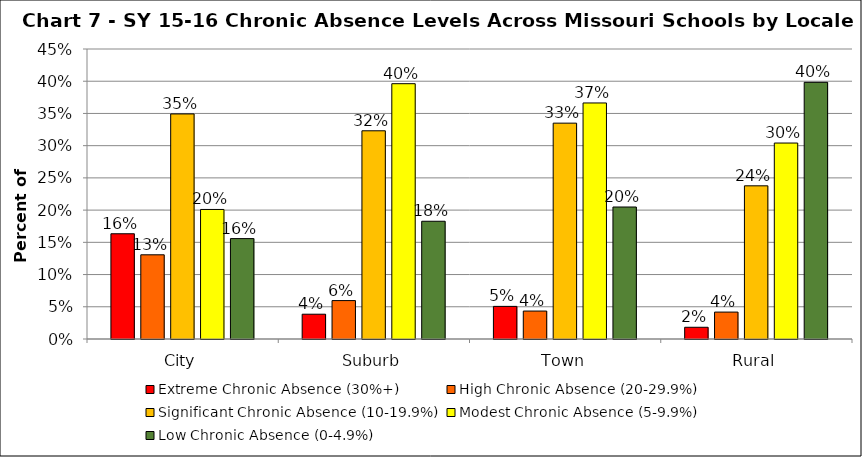
| Category | Extreme Chronic Absence (30%+) | High Chronic Absence (20-29.9%) | Significant Chronic Absence (10-19.9%) | Modest Chronic Absence (5-9.9%) | Low Chronic Absence (0-4.9%) |
|---|---|---|---|---|---|
| 0 | 0.163 | 0.131 | 0.349 | 0.201 | 0.156 |
| 1 | 0.038 | 0.06 | 0.323 | 0.396 | 0.183 |
| 2 | 0.051 | 0.043 | 0.335 | 0.366 | 0.205 |
| 3 | 0.018 | 0.042 | 0.238 | 0.304 | 0.398 |